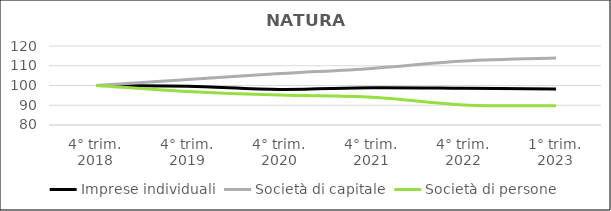
| Category | Imprese individuali | Società di capitale | Società di persone |
|---|---|---|---|
| 4° trim.
2018 | 100 | 100 | 100 |
| 4° trim.
2019 | 99.573 | 103.065 | 97.006 |
| 4° trim.
2020 | 98.035 | 106.033 | 95.134 |
| 4° trim.
2021 | 98.871 | 108.655 | 94.066 |
| 4° trim.
2022 | 98.631 | 112.396 | 90.182 |
| 1° trim.
2023 | 98.233 | 113.869 | 89.691 |